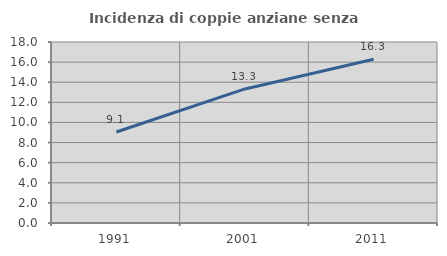
| Category | Incidenza di coppie anziane senza figli  |
|---|---|
| 1991.0 | 9.051 |
| 2001.0 | 13.333 |
| 2011.0 | 16.283 |